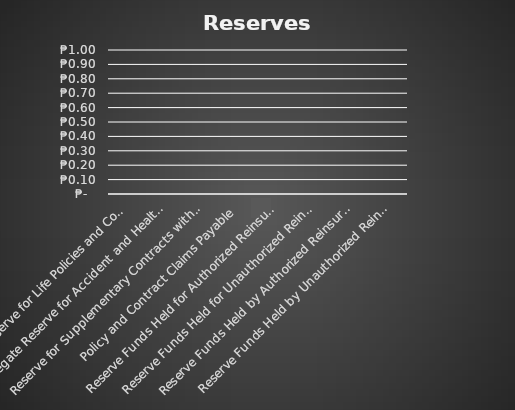
| Category | Series 2 |
|---|---|
| Aggregate Reserve for Life Policies and Contracts | 0 |
| Aggregate Reserve for Accident and Health Policies | 0 |
| Reserve for Supplementary Contracts without Life Contingencies | 0 |
| Policy and Contract Claims Payable | 0 |
| Reserve Funds Held for Authorized Reinsurers | 0 |
| Reserve Funds Held for Unauthorized Reinsurers | 0 |
| Reserve Funds Held by Authorized Reinsurers | 0 |
| Reserve Funds Held by Unauthorized Reinsurers | 0 |